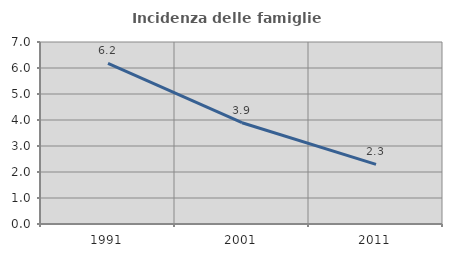
| Category | Incidenza delle famiglie numerose |
|---|---|
| 1991.0 | 6.174 |
| 2001.0 | 3.896 |
| 2011.0 | 2.293 |